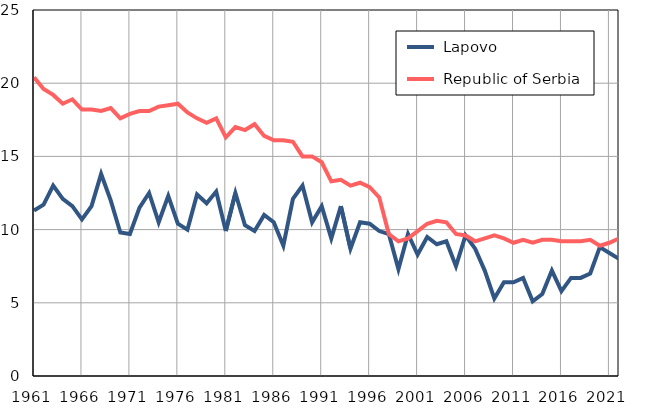
| Category |  Lapovo |  Republic of Serbia |
|---|---|---|
| 1961.0 | 11.3 | 20.4 |
| 1962.0 | 11.7 | 19.6 |
| 1963.0 | 13 | 19.2 |
| 1964.0 | 12.1 | 18.6 |
| 1965.0 | 11.6 | 18.9 |
| 1966.0 | 10.7 | 18.2 |
| 1967.0 | 11.6 | 18.2 |
| 1968.0 | 13.8 | 18.1 |
| 1969.0 | 12 | 18.3 |
| 1970.0 | 9.8 | 17.6 |
| 1971.0 | 9.7 | 17.9 |
| 1972.0 | 11.5 | 18.1 |
| 1973.0 | 12.5 | 18.1 |
| 1974.0 | 10.5 | 18.4 |
| 1975.0 | 12.3 | 18.5 |
| 1976.0 | 10.4 | 18.6 |
| 1977.0 | 10 | 18 |
| 1978.0 | 12.4 | 17.6 |
| 1979.0 | 11.8 | 17.3 |
| 1980.0 | 12.6 | 17.6 |
| 1981.0 | 9.9 | 16.3 |
| 1982.0 | 12.5 | 17 |
| 1983.0 | 10.3 | 16.8 |
| 1984.0 | 9.9 | 17.2 |
| 1985.0 | 11 | 16.4 |
| 1986.0 | 10.5 | 16.1 |
| 1987.0 | 8.9 | 16.1 |
| 1988.0 | 12.1 | 16 |
| 1989.0 | 13 | 15 |
| 1990.0 | 10.5 | 15 |
| 1991.0 | 11.6 | 14.6 |
| 1992.0 | 9.4 | 13.3 |
| 1993.0 | 11.6 | 13.4 |
| 1994.0 | 8.7 | 13 |
| 1995.0 | 10.5 | 13.2 |
| 1996.0 | 10.4 | 12.9 |
| 1997.0 | 9.9 | 12.2 |
| 1998.0 | 9.7 | 9.7 |
| 1999.0 | 7.3 | 9.2 |
| 2000.0 | 9.7 | 9.4 |
| 2001.0 | 8.3 | 9.9 |
| 2002.0 | 9.5 | 10.4 |
| 2003.0 | 9 | 10.6 |
| 2004.0 | 9.2 | 10.5 |
| 2005.0 | 7.5 | 9.7 |
| 2006.0 | 9.6 | 9.6 |
| 2007.0 | 8.7 | 9.2 |
| 2008.0 | 7.2 | 9.4 |
| 2009.0 | 5.3 | 9.6 |
| 2010.0 | 6.4 | 9.4 |
| 2011.0 | 6.4 | 9.1 |
| 2012.0 | 6.7 | 9.3 |
| 2013.0 | 5.1 | 9.1 |
| 2014.0 | 5.6 | 9.3 |
| 2015.0 | 7.2 | 9.3 |
| 2016.0 | 5.8 | 9.2 |
| 2017.0 | 6.7 | 9.2 |
| 2018.0 | 6.7 | 9.2 |
| 2019.0 | 7 | 9.3 |
| 2020.0 | 8.8 | 8.9 |
| 2021.0 | 8.4 | 9.1 |
| 2022.0 | 8 | 9.4 |